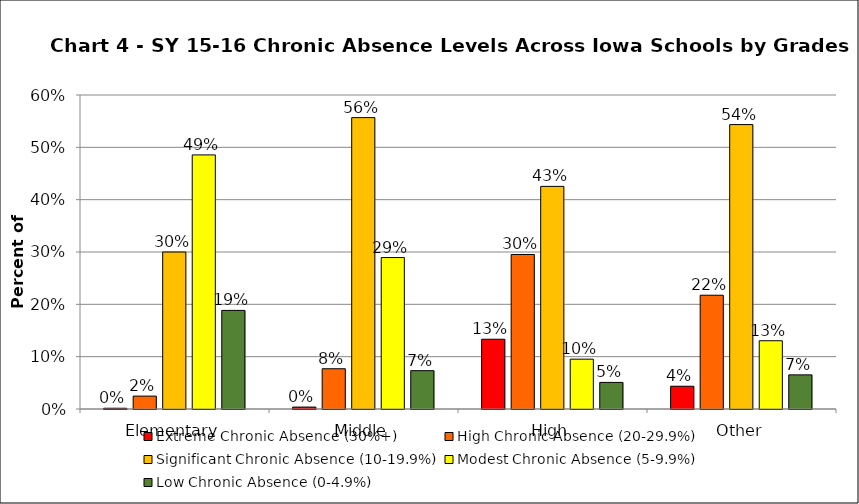
| Category | Extreme Chronic Absence (30%+) | High Chronic Absence (20-29.9%) | Significant Chronic Absence (10-19.9%) | Modest Chronic Absence (5-9.9%) | Low Chronic Absence (0-4.9%) |
|---|---|---|---|---|---|
| 0 | 0.001 | 0.025 | 0.3 | 0.486 | 0.188 |
| 1 | 0.004 | 0.077 | 0.557 | 0.289 | 0.073 |
| 2 | 0.133 | 0.295 | 0.425 | 0.095 | 0.051 |
| 3 | 0.043 | 0.217 | 0.543 | 0.13 | 0.065 |